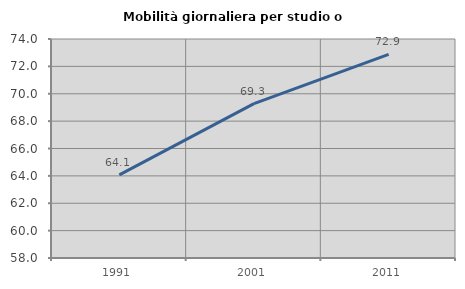
| Category | Mobilità giornaliera per studio o lavoro |
|---|---|
| 1991.0 | 64.076 |
| 2001.0 | 69.279 |
| 2011.0 | 72.87 |